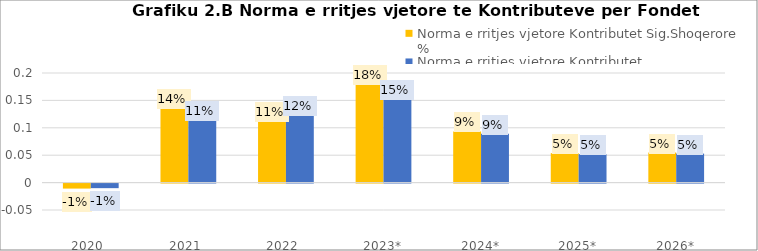
| Category | Norma e rritjes vjetore Kontributet Sig.Shoqerore %  | Norma e rritjes vjetore Kontributet Sig.Shendetesore %  |
|---|---|---|
| 2020  | -0.009 | -0.008 |
| 2021  | 0.137 | 0.114 |
| 2022  | 0.113 | 0.124 |
| 2023* | 0.18 | 0.153 |
| 2024* | 0.093 | 0.089 |
| 2025* | 0.054 | 0.052 |
| 2026* | 0.055 | 0.053 |